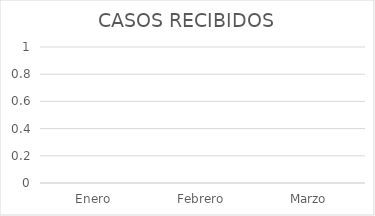
| Category | Series 0 |
|---|---|
| Enero | 0 |
| Febrero | 0 |
| Marzo | 0 |